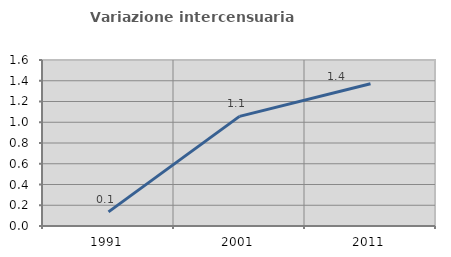
| Category | Variazione intercensuaria annua |
|---|---|
| 1991.0 | 0.136 |
| 2001.0 | 1.057 |
| 2011.0 | 1.371 |